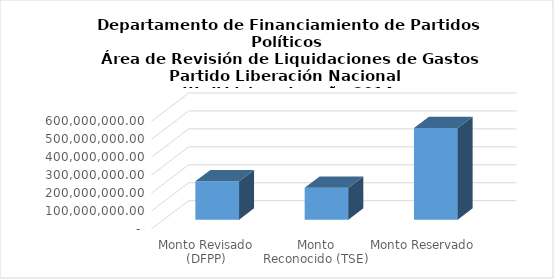
| Category | Series 0 |
|---|---|
| Monto Revisado (DFPP) | 213920340.85 |
| Monto Reconocido (TSE) | 178044509.88 |
| Monto Reservado  | 510820786.566 |